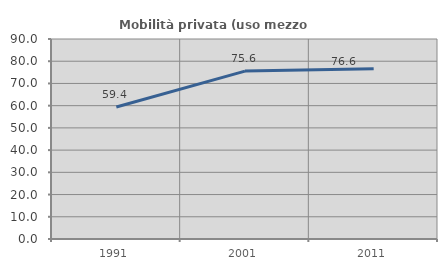
| Category | Mobilità privata (uso mezzo privato) |
|---|---|
| 1991.0 | 59.417 |
| 2001.0 | 75.551 |
| 2011.0 | 76.6 |